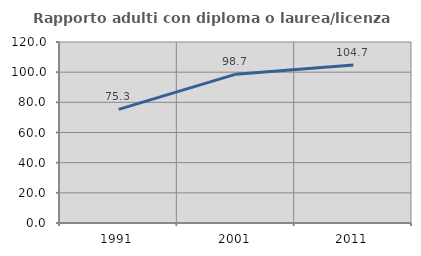
| Category | Rapporto adulti con diploma o laurea/licenza media  |
|---|---|
| 1991.0 | 75.325 |
| 2001.0 | 98.684 |
| 2011.0 | 104.706 |